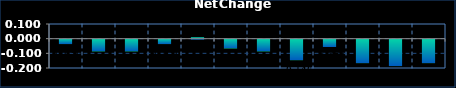
| Category | Series 0 |
|---|---|
| 0 | -0.03 |
| 1 | -0.08 |
| 2 | -0.08 |
| 3 | -0.03 |
| 4 | 0.01 |
| 5 | -0.06 |
| 6 | -0.08 |
| 7 | -0.14 |
| 8 | -0.05 |
| 9 | -0.16 |
| 10 | -0.18 |
| 11 | -0.16 |